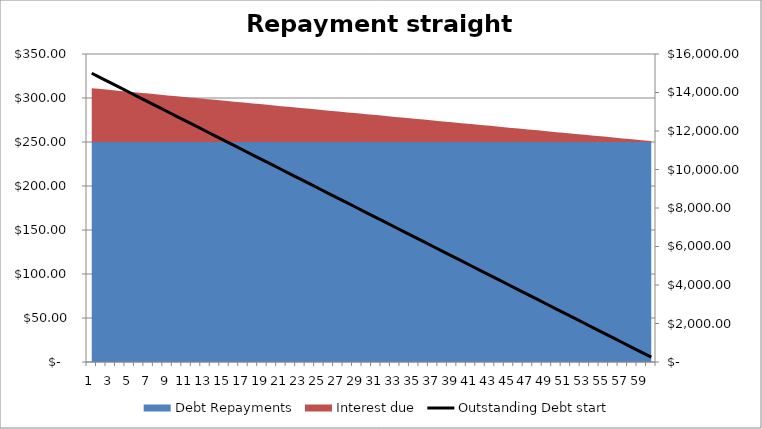
| Category | Outstanding Debt start |
|---|---|
| 0 | 15000 |
| 1 | 14750 |
| 2 | 14500 |
| 3 | 14250 |
| 4 | 14000 |
| 5 | 13750 |
| 6 | 13500 |
| 7 | 13250 |
| 8 | 13000 |
| 9 | 12750 |
| 10 | 12500 |
| 11 | 12250 |
| 12 | 12000 |
| 13 | 11750 |
| 14 | 11500 |
| 15 | 11250 |
| 16 | 11000 |
| 17 | 10750 |
| 18 | 10500 |
| 19 | 10250 |
| 20 | 10000 |
| 21 | 9750 |
| 22 | 9500 |
| 23 | 9250 |
| 24 | 9000 |
| 25 | 8750 |
| 26 | 8500 |
| 27 | 8250 |
| 28 | 8000 |
| 29 | 7750 |
| 30 | 7500 |
| 31 | 7250 |
| 32 | 7000 |
| 33 | 6750 |
| 34 | 6500 |
| 35 | 6250 |
| 36 | 6000 |
| 37 | 5750 |
| 38 | 5500 |
| 39 | 5250 |
| 40 | 5000 |
| 41 | 4750 |
| 42 | 4500 |
| 43 | 4250 |
| 44 | 4000 |
| 45 | 3750 |
| 46 | 3500 |
| 47 | 3250 |
| 48 | 3000 |
| 49 | 2750 |
| 50 | 2500 |
| 51 | 2250 |
| 52 | 2000 |
| 53 | 1750 |
| 54 | 1500 |
| 55 | 1250 |
| 56 | 1000 |
| 57 | 750 |
| 58 | 500 |
| 59 | 250 |